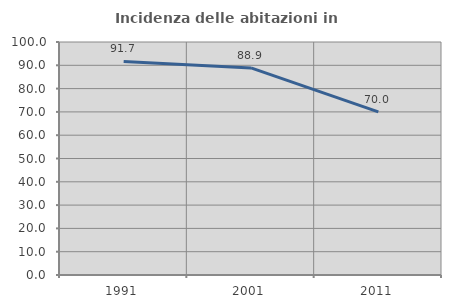
| Category | Incidenza delle abitazioni in proprietà  |
|---|---|
| 1991.0 | 91.667 |
| 2001.0 | 88.889 |
| 2011.0 | 70 |